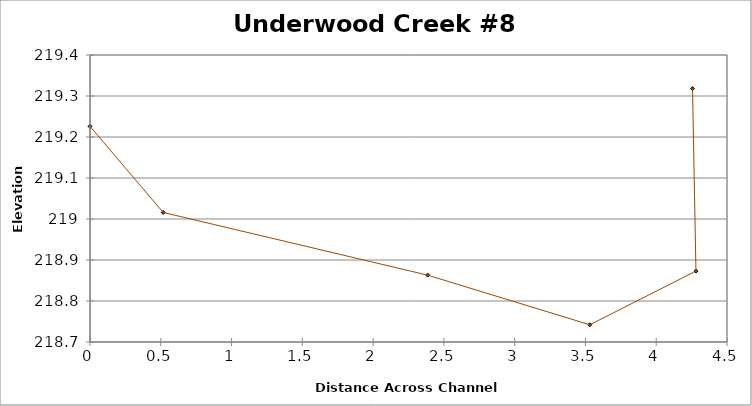
| Category | Series 0 |
|---|---|
| 0.0 | 219.226 |
| 0.5171247425480806 | 219.016 |
| 2.3856581900826126 | 218.863 |
| 3.5308945034462647 | 218.742 |
| 4.280770958142972 | 218.873 |
| 4.256446052436543 | 219.318 |